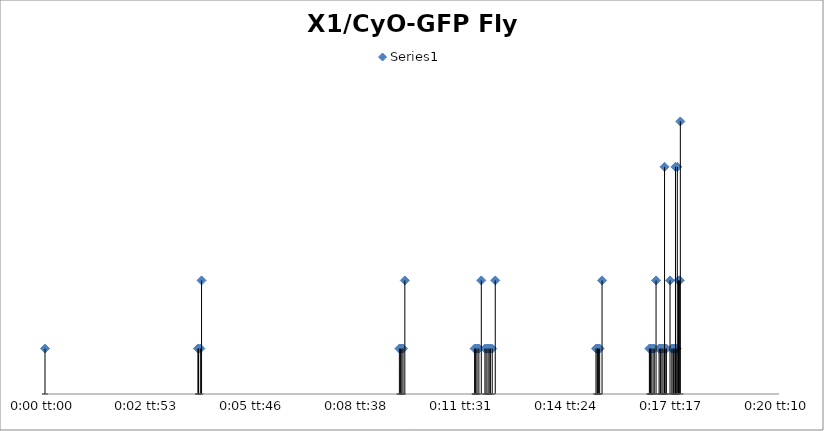
| Category | Series 0 |
|---|---|
| 0.0 | 2 |
| 0.0029166666666666785 | 2 |
| 0.002928240740740745 | 2 |
| 0.002962962962962959 | 2 |
| 0.002986111111111106 | 5 |
| 0.0067592592592592565 | 2 |
| 0.006782407407407404 | 2 |
| 0.006805555555555565 | 2 |
| 0.006828703703703712 | 2 |
| 0.0068634259259259395 | 5 |
| 0.008194444444444449 | 2 |
| 0.008206018518518515 | 2 |
| 0.008217592592592596 | 2 |
| 0.008240740740740743 | 2 |
| 0.00827546296296297 | 2 |
| 0.008321759259259265 | 5 |
| 0.008391203703703692 | 2 |
| 0.008414351851851853 | 2 |
| 0.008449074074074081 | 2 |
| 0.008472222222222228 | 2 |
| 0.008495370370370375 | 2 |
| 0.008530092592592589 | 2 |
| 0.008587962962962964 | 5 |
| 0.010509259259259274 | 2 |
| 0.010532407407407407 | 2 |
| 0.010543981481481474 | 2 |
| 0.010555555555555554 | 2 |
| 0.010578703703703701 | 2 |
| 0.01062500000000001 | 5 |
| 0.011527777777777776 | 2 |
| 0.011539351851851856 | 2 |
| 0.011550925925925937 | 2 |
| 0.011562500000000003 | 2 |
| 0.011597222222222231 | 2 |
| 0.011620370370370364 | 2 |
| 0.011655092592592592 | 5 |
| 0.011712962962962953 | 2 |
| 0.011736111111111114 | 2 |
| 0.01174768518518518 | 2 |
| 0.011770833333333341 | 2 |
| 0.011805555555555569 | 2 |
| 0.011817129629629636 | 10 |
| 0.011828703703703716 | 2 |
| 0.01185185185185185 | 2 |
| 0.011921296296296305 | 5 |
| 0.011956018518518519 | 2 |
| 0.011979166666666666 | 2 |
| 0.011990740740740746 | 2 |
| 0.012013888888888893 | 2 |
| 0.012025462962962974 | 10 |
| 0.012048611111111121 | 2 |
| 0.012060185185185202 | 10 |
| 0.012083333333333335 | 5 |
| 0.012094907407407401 | 5 |
| 0.012106481481481482 | 5 |
| 0.012118055555555562 | 12 |